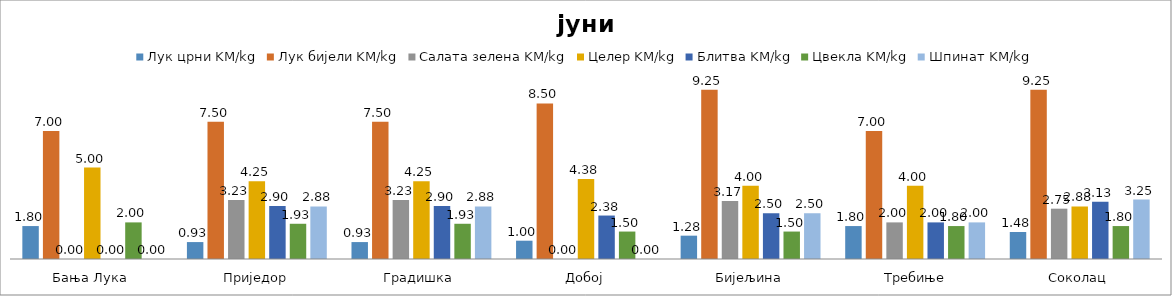
| Category | Лук црни KM/kg | Лук бијели KM/kg | Салата зелена KM/kg | Целер KM/kg | Блитва KM/kg | Цвекла KM/kg | Шпинат KM/kg |
|---|---|---|---|---|---|---|---|
| Бања Лука | 1.8 | 7 | 0 | 5 | 0 | 2 | 0 |
| Приједор | 0.925 | 7.5 | 3.225 | 4.25 | 2.9 | 1.925 | 2.875 |
| Градишка | 0.925 | 7.5 | 3.225 | 4.25 | 2.9 | 1.925 | 2.875 |
| Добој | 1 | 8.5 | 0 | 4.375 | 2.375 | 1.5 | 0 |
| Бијељина | 1.275 | 9.25 | 3.167 | 4 | 2.5 | 1.5 | 2.5 |
|  Требиње | 1.8 | 7 | 2 | 4 | 2 | 1.8 | 2 |
| Соколац | 1.475 | 9.25 | 2.75 | 2.875 | 3.125 | 1.8 | 3.25 |